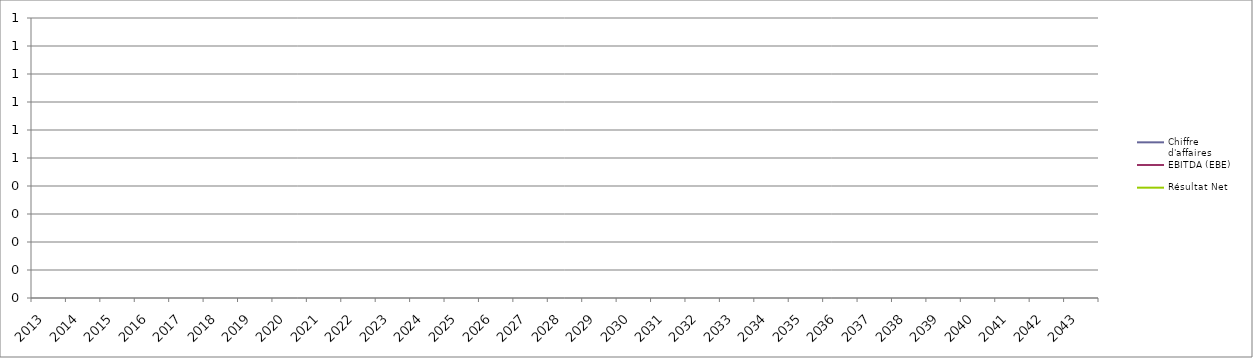
| Category | Chiffre d'affaires | EBITDA (EBE) | Résultat Net |
|---|---|---|---|
| 2013.0 | 0 | 0 | 0 |
| 2014.0 | 0 | 0 | 0 |
| 2015.0 | 0 | 0 | 0 |
| 2016.0 | 0 | 0 | 0 |
| 2017.0 | 0 | 0 | 0 |
| 2018.0 | 0 | 0 | 0 |
| 2019.0 | 0 | 0 | 0 |
| 2020.0 | 0 | 0 | 0 |
| 2021.0 | 0 | 0 | 0 |
| 2022.0 | 0 | 0 | 0 |
| 2023.0 | 0 | 0 | 0 |
| 2024.0 | 0 | 0 | 0 |
| 2025.0 | 0 | 0 | 0 |
| 2026.0 | 0 | 0 | 0 |
| 2027.0 | 0 | 0 | 0 |
| 2028.0 | 0 | 0 | 0 |
| 2029.0 | 0 | 0 | 0 |
| 2030.0 | 0 | 0 | 0 |
| 2031.0 | 0 | 0 | 0 |
| 2032.0 | 0 | 0 | 0 |
| 2033.0 | 0 | 0 | 0 |
| 2034.0 | 0 | 0 | 0 |
| 2035.0 | 0 | 0 | 0 |
| 2036.0 | 0 | 0 | 0 |
| 2037.0 | 0 | 0 | 0 |
| 2038.0 | 0 | 0 | 0 |
| 2039.0 | 0 | 0 | 0 |
| 2040.0 | 0 | 0 | 0 |
| 2041.0 | 0 | 0 | 0 |
| 2042.0 | 0 | 0 | 0 |
| 2043.0 | 0 | 0 | 0 |